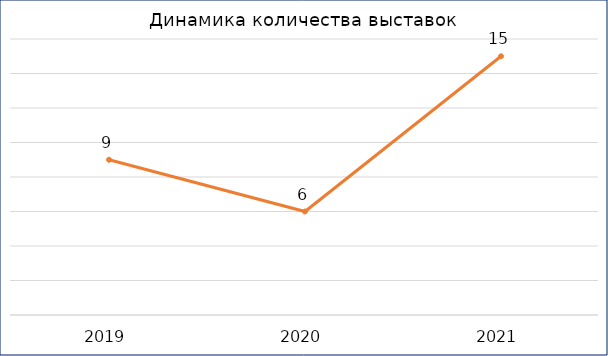
| Category | Кол-во выставок |
|---|---|
| 2019.0 | 9 |
| 2020.0 | 6 |
| 2021.0 | 15 |